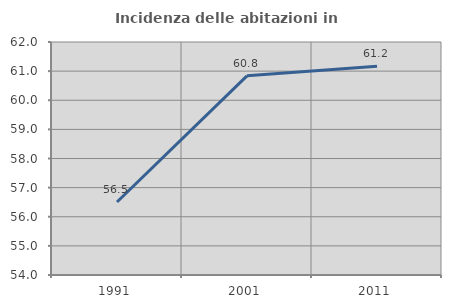
| Category | Incidenza delle abitazioni in proprietà  |
|---|---|
| 1991.0 | 56.506 |
| 2001.0 | 60.837 |
| 2011.0 | 61.164 |